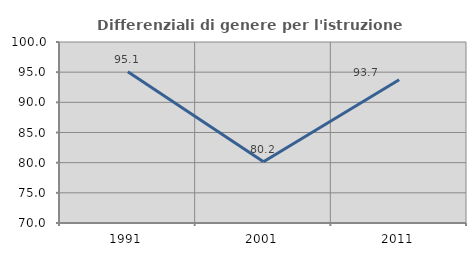
| Category | Differenziali di genere per l'istruzione superiore |
|---|---|
| 1991.0 | 95.052 |
| 2001.0 | 80.151 |
| 2011.0 | 93.737 |